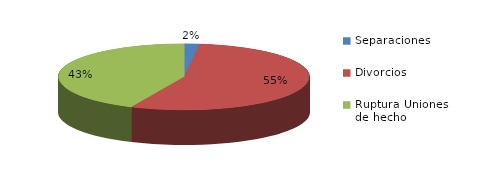
| Category | Series 0 |
|---|---|
| Separaciones | 33 |
| Divorcios | 923 |
| Ruptura Uniones de hecho | 726 |